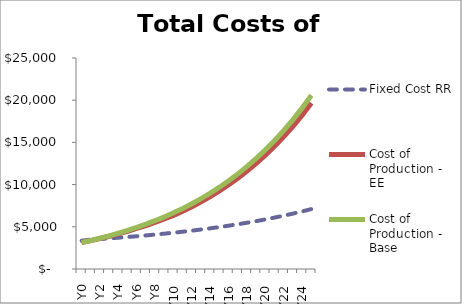
| Category | Fixed Cost RR | Cost of Production - EE | Cost of Production - Base |
|---|---|---|---|
| Y0 | 3353681164.455 | 3134434200.548 | 3134434200.548 |
| Y1 | 3481083513.765 | 3366970885.283 | 3379434390.231 |
| Y2 | 3552887131.806 | 3616140504.031 | 3643589229.385 |
| Y3 | 3628765352.147 | 3883044431.826 | 3928396620.887 |
| Y4 | 3708980246.438 | 4168843907.121 | 4235471632.064 |
| Y5 | 3793810893.21 | 4474761200.184 | 4566555661.369 |
| Y6 | 3883554483.047 | 4802080398.951 | 4923526322.41 |
| Y7 | 3978527495.587 | 5152147718.198 | 5308408101.479 |
| Y8 | 4079066953.028 | 5526371221.768 | 5723383849.141 |
| Y9 | 4185531755.109 | 5926219829.081 | 6170807171.154 |
| Y10 | 4298304100.858 | 6353221455.79 | 6653215789.137 |
| Y11 | 4417791002.759 | 6850026224.625 | 7173345946.88 |
| Y12 | 4544425899.326 | 7385688961.465 | 7734147944.175 |
| Y13 | 4678670372.502 | 7963249697.589 | 8338802886.414 |
| Y14 | 4821015976.679 | 8585986356.738 | 8990740745.137 |
| Y15 | 4971986186.602 | 9257433375.512 | 9693659832.175 |
| Y16 | 5132138471.889 | 9981401781.59 | 10451547798.028 |
| Y17 | 5302066506.385 | 10762000843.93 | 11268704273.832 |
| Y18 | 5482402521.123 | 11603661418.059 | 12149765285.59 |
| Y19 | 5673819810.228 | 12511161119.199 | 13099729579.412 |
| Y20 | 5877035399.696 | 13489651466.378 | 14123987007.389 |
| Y21 | 6092812889.646 | 14544687151.891 | 15228349135.452 |
| Y22 | 6321965481.309 | 15682257602.553 | 16419082247.166 |
| Y23 | 6565359200.774 | 16908821012.248 | 17702942931.073 |
| Y24 | 6823916332.27 | 18231341039.32 | 19087216453.874 |
| Y25 | 7098619074.611 | 19657326377.527 | 20579758137.576 |